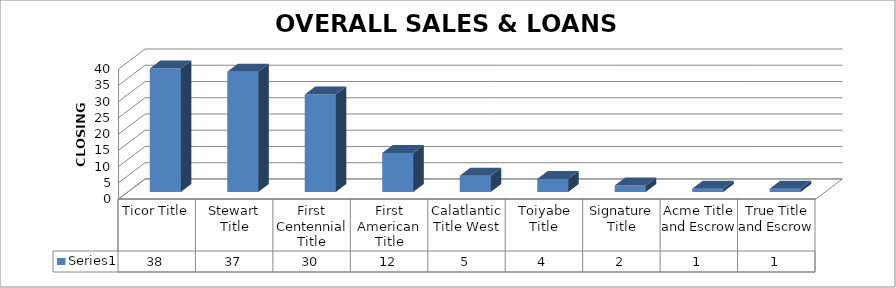
| Category | Series 0 |
|---|---|
| Ticor Title | 38 |
| Stewart Title | 37 |
| First Centennial Title | 30 |
| First American Title | 12 |
| Calatlantic Title West | 5 |
| Toiyabe Title | 4 |
| Signature Title | 2 |
| Acme Title and Escrow | 1 |
| True Title and Escrow | 1 |